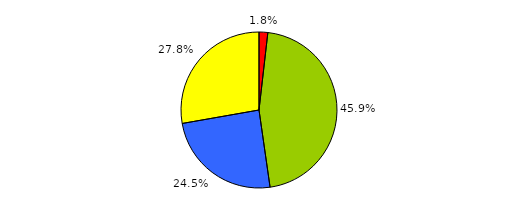
| Category | Series 0 |
|---|---|
| 0 | 10 |
| 1 | 253 |
| 2 | 135 |
| 3 | 153 |